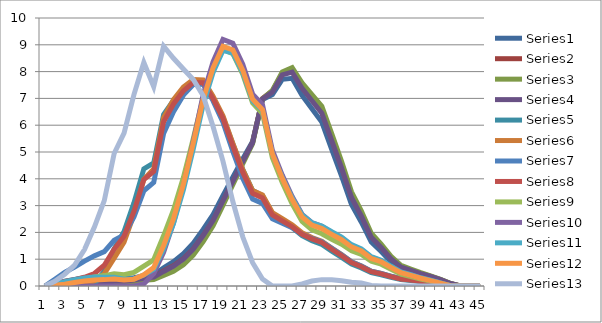
| Category | Series 0 | Series 1 | Series 2 | Series 3 | Series 4 | Series 5 | Series 6 | Series 7 | Series 8 | Series 9 | Series 10 | Series 11 | Series 12 |
|---|---|---|---|---|---|---|---|---|---|---|---|---|---|
| 0 | 0 | 0 | 0 | 0 | 0 | 0 | 0 | 0 | 0 | 0 | 0 | 0 | 0 |
| 1 | 0.087 | 0 | 0 | 0.029 | 0 | 0 | 0.251 | 0.083 | 0 | 0 | 0.077 | 0.024 | 0.177 |
| 2 | 0.179 | 0 | 0 | 0.059 | 0 | 0 | 0.511 | 0.172 | 0.028 | 0 | 0.158 | 0.064 | 0.44 |
| 3 | 0.243 | 0 | 0 | 0.081 | 0 | 0 | 0.71 | 0.234 | 0.166 | 0 | 0.231 | 0.131 | 0.777 |
| 4 | 0.308 | 0 | 0 | 0.102 | 0 | 0.049 | 0.93 | 0.325 | 0.257 | 0 | 0.297 | 0.185 | 1.359 |
| 5 | 0.343 | 0 | 0 | 0.116 | 0.087 | 0.196 | 1.125 | 0.465 | 0.341 | 0 | 0.335 | 0.225 | 2.199 |
| 6 | 0.336 | 0 | 0 | 0.109 | 0.55 | 0.459 | 1.283 | 0.773 | 0.388 | 0 | 0.325 | 0.238 | 3.185 |
| 7 | 0.35 | 0.083 | 0.082 | 0.174 | 1.389 | 1.042 | 1.707 | 1.378 | 0.458 | 0 | 0.327 | 0.261 | 4.946 |
| 8 | 0.29 | 0.135 | 0.112 | 0.179 | 2.034 | 1.638 | 1.903 | 1.858 | 0.424 | 0 | 0.256 | 0.227 | 5.708 |
| 9 | 0.305 | 0.201 | 0.152 | 0.219 | 3.103 | 2.669 | 2.575 | 2.782 | 0.507 | 0 | 0.27 | 0.255 | 7.143 |
| 10 | 0.371 | 0.291 | 0.21 | 0.291 | 4.372 | 3.986 | 3.554 | 3.97 | 0.74 | 0.078 | 0.408 | 0.415 | 8.34 |
| 11 | 0.412 | 0.339 | 0.237 | 0.33 | 4.591 | 4.371 | 3.863 | 4.275 | 0.979 | 0.468 | 0.624 | 0.686 | 7.439 |
| 12 | 0.676 | 0.56 | 0.393 | 0.543 | 6.398 | 6.287 | 5.687 | 6.124 | 1.874 | 1.259 | 1.379 | 1.505 | 8.951 |
| 13 | 0.906 | 0.756 | 0.552 | 0.738 | 6.924 | 6.956 | 6.5 | 6.794 | 2.837 | 2.355 | 2.333 | 2.508 | 8.498 |
| 14 | 1.202 | 1.018 | 0.792 | 1.004 | 7.3 | 7.421 | 7.123 | 7.281 | 4.046 | 3.739 | 3.584 | 3.79 | 8.098 |
| 15 | 1.596 | 1.384 | 1.151 | 1.377 | 7.548 | 7.706 | 7.518 | 7.591 | 5.495 | 5.392 | 5.117 | 5.335 | 7.707 |
| 16 | 2.109 | 1.877 | 1.658 | 1.881 | 7.536 | 7.685 | 7.536 | 7.586 | 7.024 | 7.129 | 6.763 | 6.972 | 7.097 |
| 17 | 2.663 | 2.433 | 2.249 | 2.448 | 6.979 | 7.084 | 6.909 | 6.99 | 8.098 | 8.366 | 7.963 | 8.142 | 5.953 |
| 18 | 3.371 | 3.156 | 3.011 | 3.179 | 6.301 | 6.356 | 6.114 | 6.257 | 8.829 | 9.199 | 8.792 | 8.94 | 4.663 |
| 19 | 4.057 | 3.885 | 3.781 | 3.908 | 5.307 | 5.322 | 5.021 | 5.217 | 8.665 | 9.059 | 8.692 | 8.806 | 3.153 |
| 20 | 4.738 | 4.627 | 4.556 | 4.64 | 4.35 | 4.348 | 4.022 | 4.24 | 7.906 | 8.276 | 7.966 | 8.049 | 1.836 |
| 21 | 5.394 | 5.354 | 5.31 | 5.353 | 3.561 | 3.561 | 3.247 | 3.456 | 6.832 | 7.159 | 6.91 | 6.967 | 0.868 |
| 22 | 6.954 | 7.001 | 6.983 | 6.979 | 3.375 | 3.394 | 3.082 | 3.284 | 6.435 | 6.762 | 6.545 | 6.58 | 0.262 |
| 23 | 7.146 | 7.28 | 7.298 | 7.241 | 2.696 | 2.741 | 2.511 | 2.649 | 4.788 | 5.067 | 4.922 | 4.925 | 0 |
| 24 | 7.711 | 7.932 | 7.991 | 7.878 | 2.438 | 2.511 | 2.344 | 2.431 | 3.863 | 4.139 | 4.04 | 4.014 | 0 |
| 25 | 7.75 | 8.044 | 8.146 | 7.98 | 2.183 | 2.28 | 2.174 | 2.212 | 3.061 | 3.337 | 3.279 | 3.226 | 0 |
| 26 | 7.112 | 7.444 | 7.578 | 7.378 | 1.877 | 1.985 | 1.925 | 1.929 | 2.408 | 2.675 | 2.649 | 2.577 | 0.078 |
| 27 | 6.614 | 6.979 | 7.144 | 6.912 | 1.691 | 1.807 | 1.773 | 1.757 | 2.093 | 2.364 | 2.359 | 2.272 | 0.184 |
| 28 | 6.115 | 6.509 | 6.704 | 6.443 | 1.548 | 1.67 | 1.65 | 1.623 | 1.951 | 2.229 | 2.24 | 2.14 | 0.237 |
| 29 | 5.1 | 5.481 | 5.683 | 5.421 | 1.301 | 1.415 | 1.402 | 1.373 | 1.743 | 2.003 | 2.025 | 1.924 | 0.232 |
| 30 | 4.096 | 4.448 | 4.644 | 4.396 | 1.067 | 1.17 | 1.16 | 1.132 | 1.559 | 1.795 | 1.823 | 1.726 | 0.198 |
| 31 | 3.045 | 3.342 | 3.516 | 3.301 | 0.821 | 0.906 | 0.899 | 0.875 | 1.315 | 1.514 | 1.543 | 1.458 | 0.143 |
| 32 | 2.379 | 2.641 | 2.8 | 2.607 | 0.673 | 0.749 | 0.743 | 0.722 | 1.177 | 1.354 | 1.384 | 1.305 | 0.111 |
| 33 | 1.643 | 1.844 | 1.97 | 1.819 | 0.496 | 0.555 | 0.551 | 0.534 | 0.928 | 1.067 | 1.093 | 1.029 | 0.02 |
| 34 | 1.286 | 1.456 | 1.565 | 1.436 | 0.42 | 0.472 | 0.471 | 0.454 | 0.814 | 0.937 | 0.962 | 0.905 | 0 |
| 35 | 0.904 | 1.028 | 1.109 | 1.014 | 0.322 | 0.362 | 0.364 | 0.349 | 0.622 | 0.717 | 0.736 | 0.691 | 0 |
| 36 | 0.63 | 0.714 | 0.769 | 0.704 | 0.24 | 0.269 | 0.272 | 0.26 | 0.444 | 0.513 | 0.526 | 0.494 | 0 |
| 37 | 0.523 | 0.588 | 0.629 | 0.58 | 0.207 | 0.23 | 0.234 | 0.223 | 0.355 | 0.411 | 0.421 | 0.396 | 0 |
| 38 | 0.422 | 0.468 | 0.496 | 0.462 | 0.167 | 0.184 | 0.188 | 0.179 | 0.26 | 0.301 | 0.307 | 0.289 | 0 |
| 39 | 0.326 | 0.359 | 0.377 | 0.354 | 0.125 | 0.137 | 0.14 | 0.134 | 0.182 | 0.211 | 0.214 | 0.202 | 0 |
| 40 | 0.221 | 0.243 | 0.253 | 0.239 | 0.025 | 0.027 | 0.027 | 0.026 | 0.098 | 0.114 | 0.115 | 0.109 | 0 |
| 41 | 0.085 | 0.095 | 0.099 | 0.093 | 0 | 0 | 0 | 0 | 0.01 | 0.011 | 0.011 | 0.011 | 0 |
| 42 | 0.002 | 0.003 | 0.003 | 0.003 | 0 | 0 | 0 | 0 | 0 | 0 | 0 | 0 | 0 |
| 43 | 0 | 0 | 0 | 0 | 0 | 0 | 0 | 0 | 0 | 0 | 0 | 0 | 0 |
| 44 | 0 | 0 | 0 | 0 | 0 | 0 | 0 | 0 | 0 | 0 | 0 | 0 | 0 |